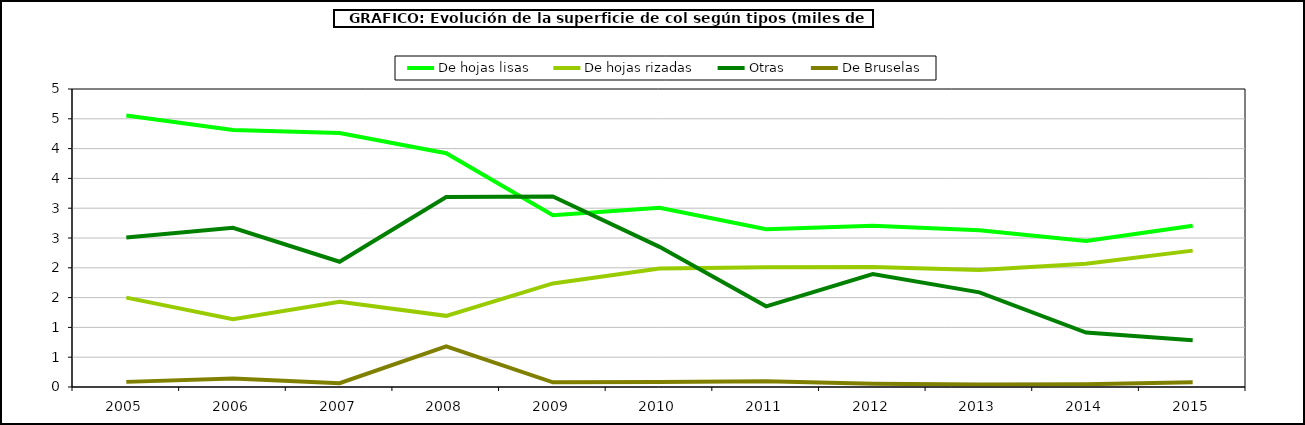
| Category | De hojas lisas | De hojas rizadas | Otras | De Bruselas |
|---|---|---|---|---|
| 2005.0 | 4.554 | 1.5 | 2.509 | 0.086 |
| 2006.0 | 4.314 | 1.136 | 2.67 | 0.141 |
| 2007.0 | 4.261 | 1.43 | 2.102 | 0.064 |
| 2008.0 | 3.923 | 1.194 | 3.189 | 0.682 |
| 2009.0 | 2.882 | 1.738 | 3.197 | 0.078 |
| 2010.0 | 3.008 | 1.987 | 2.352 | 0.083 |
| 2011.0 | 2.648 | 2.008 | 1.354 | 0.098 |
| 2012.0 | 2.707 | 2.014 | 1.895 | 0.053 |
| 2013.0 | 2.631 | 1.962 | 1.588 | 0.043 |
| 2014.0 | 2.45 | 2.067 | 0.914 | 0.048 |
| 2015.0 | 2.707 | 2.288 | 0.786 | 0.08 |